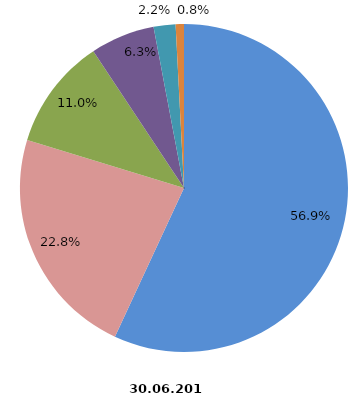
| Category | Anzahl Betriebe 2018 |
|---|---|
| 1 - 4 Beschäftigte | 1740 |
| 5 - 9 Beschäftigte | 697 |
| 10 - 19 Beschäftigte | 335 |
| 20 - 49 Beschäftigte | 194 |
| 50 - 99 Beschäftigte | 66 |
| 100 und mehr Beschäftigte | 25 |